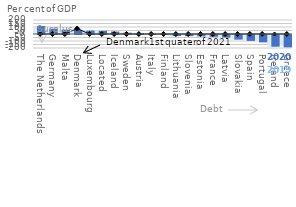
| Category | 2019 | 2020 | Series 2 |
|---|---|---|---|
| The Netherlands | 90.002 | 114.779 |  |
| Germany | 71.888 | 76.245 |  |
| Malta | 53.741 | 63.051 |  |
| Denmark | 76.811 | 61.574 |  |
| Luxembourg | 56.152 | 48.141 |  |
| Located | 50.598 | 44.924 |  |
| Iceland | 21.546 | 34.951 |  |
| Sweden | 17.792 | 18.55 |  |
| Austria | 12.128 | 10.926 |  |
| Italy | -0.918 | 1.841 |  |
| Finland | 5.181 | 1.011 |  |
| Lithuania | -24.135 | -15.641 |  |
| Slovenia | -15.354 | -16.324 |  |
| Estonia | -21.373 | -20.407 |  |
| France | -22.831 | -26.432 |  |
| Latvia | -41.721 | -36.626 |  |
| Slovakia | -66.269 | -66.012 |  |
| Spain | -73.918 | -84.311 |  |
| Portugal | -100.463 | -105.375 |  |
| Ireland | -174.022 | -167.443 |  |
| Greece | -155.844 | -176.35 |  |